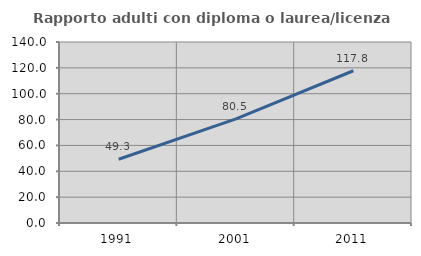
| Category | Rapporto adulti con diploma o laurea/licenza media  |
|---|---|
| 1991.0 | 49.296 |
| 2001.0 | 80.488 |
| 2011.0 | 117.766 |